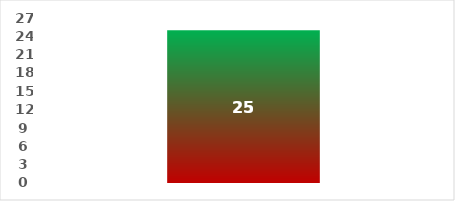
| Category | Series 0 |
|---|---|
| 0 | 25 |